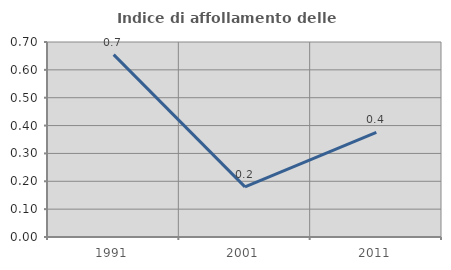
| Category | Indice di affollamento delle abitazioni  |
|---|---|
| 1991.0 | 0.655 |
| 2001.0 | 0.18 |
| 2011.0 | 0.375 |